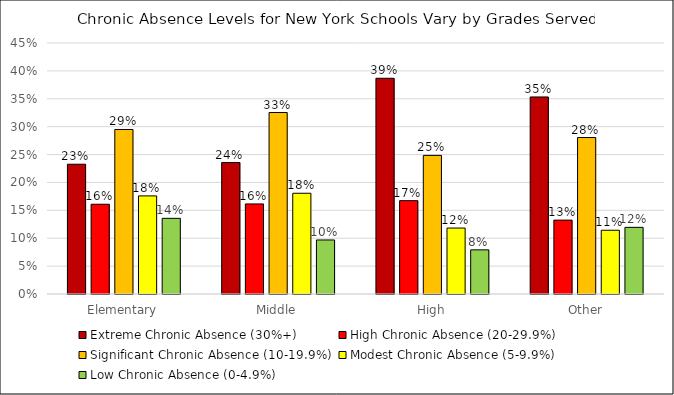
| Category | Extreme Chronic Absence (30%+) | High Chronic Absence (20-29.9%) | Significant Chronic Absence (10-19.9%) | Modest Chronic Absence (5-9.9%) | Low Chronic Absence (0-4.9%) |
|---|---|---|---|---|---|
| Elementary | 0.233 | 0.161 | 0.295 | 0.176 | 0.136 |
| Middle | 0.236 | 0.161 | 0.325 | 0.181 | 0.097 |
| High | 0.387 | 0.167 | 0.248 | 0.118 | 0.079 |
| Other | 0.353 | 0.132 | 0.281 | 0.114 | 0.119 |